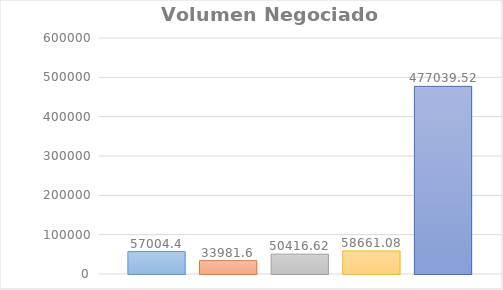
| Category | Lunes | Martes | Miercoles | Jueves | Viernes |
|---|---|---|---|---|---|
| 0 | 57004.4 | 33981.6 | 50416.62 | 58661.08 | 477039.52 |